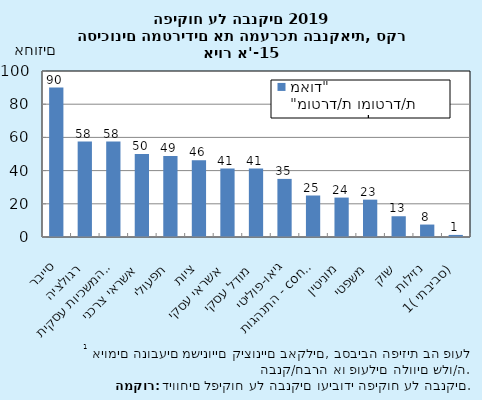
| Category | שיעור הנשאלים שהשיבו "מוטרד/ת ומוטרד/ת מאוד" |
|---|---|
| סייבר | 90 |
| רגולציה | 57.5 |
| טכנולוגי והמשכיות עסקית | 57.5 |
| אשראי צרכני | 50 |
| תפעולי | 48.75 |
| ציות | 46.25 |
| אשראי עסקי | 41.25 |
| מודל עסקי | 41.25 |
| גיאו-פוליטי | 35 |
| התנהגות - conduct | 25 |
| מוניטין | 23.75 |
| משפטי | 22.5 |
| שוק | 12.5 |
| נזילות | 7.5 |
| סביבתי (1) | 1.25 |